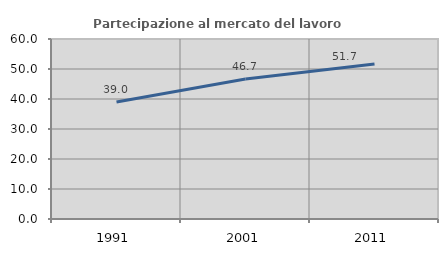
| Category | Partecipazione al mercato del lavoro  femminile |
|---|---|
| 1991.0 | 38.971 |
| 2001.0 | 46.667 |
| 2011.0 | 51.689 |